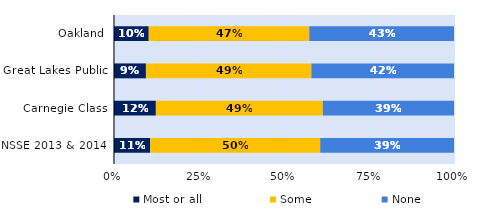
| Category | Most or all | Some | None |
|---|---|---|---|
| Oakland | 0.102 | 0.472 | 0.426 |
| Great Lakes Public | 0.094 | 0.487 | 0.419 |
| Carnegie Class | 0.123 | 0.491 | 0.386 |
| NSSE 2013 & 2014 | 0.106 | 0.5 | 0.394 |